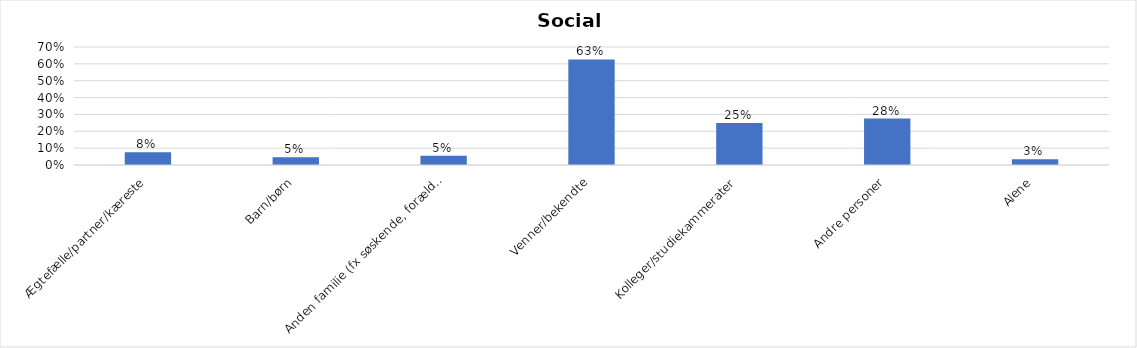
| Category | % |
|---|---|
| Ægtefælle/partner/kæreste | 0.076 |
| Barn/børn | 0.046 |
| Anden familie (fx søskende, forældre) | 0.055 |
| Venner/bekendte | 0.626 |
| Kolleger/studiekammerater | 0.25 |
| Andre personer | 0.276 |
| Alene | 0.034 |